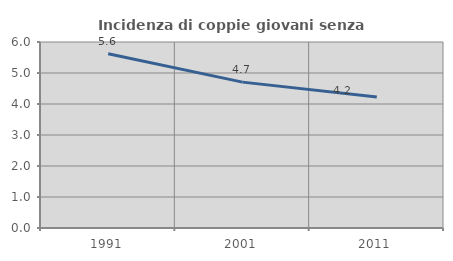
| Category | Incidenza di coppie giovani senza figli |
|---|---|
| 1991.0 | 5.622 |
| 2001.0 | 4.706 |
| 2011.0 | 4.223 |